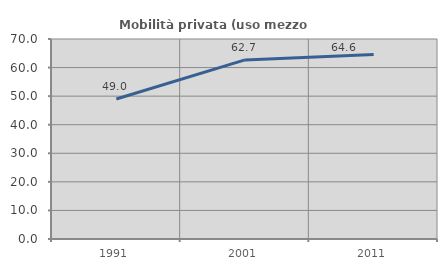
| Category | Mobilità privata (uso mezzo privato) |
|---|---|
| 1991.0 | 48.994 |
| 2001.0 | 62.692 |
| 2011.0 | 64.613 |